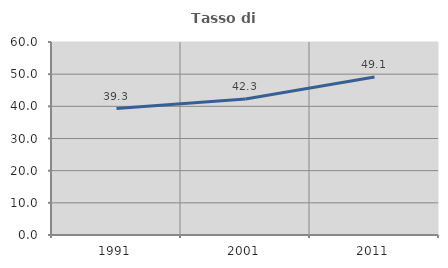
| Category | Tasso di occupazione   |
|---|---|
| 1991.0 | 39.293 |
| 2001.0 | 42.267 |
| 2011.0 | 49.132 |